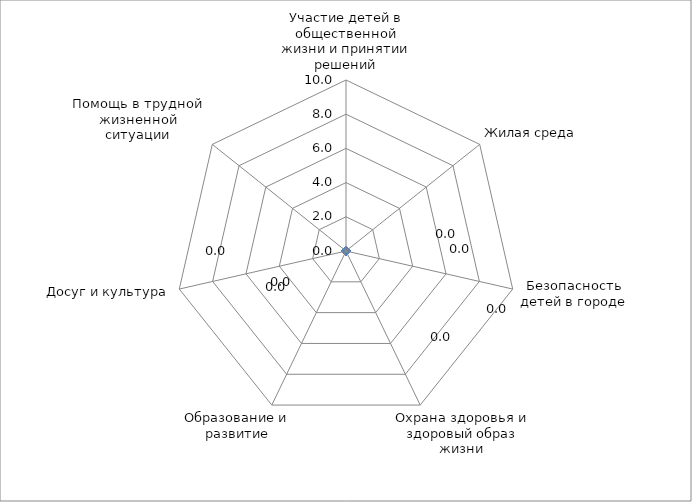
| Category | Series 0 |
|---|---|
| Участие детей в общественной жизни и принятии решений | 0 |
| Жилая среда | 0 |
| Безопасность детей в городе | 0 |
| Охрана здоровья и здоровый образ жизни | 0 |
| Образование и развитие | 0 |
| Досуг и культура | 0 |
| Помощь в трудной жизненной ситуации | 0 |